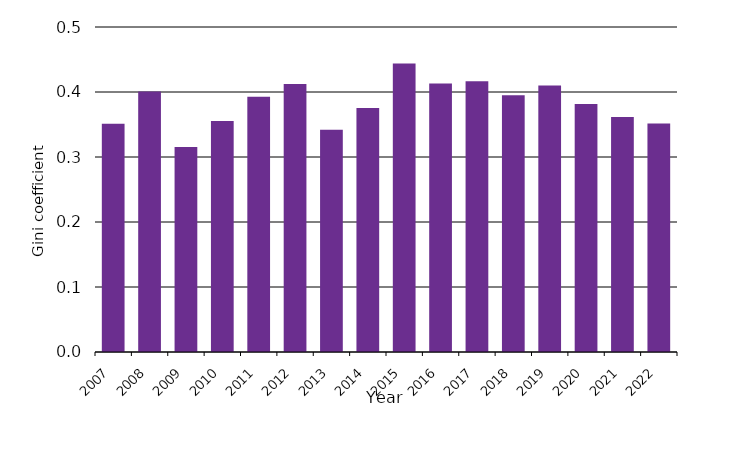
| Category | Gini coefficient |
|---|---|
| 2007.0 | 0.351 |
| 2008.0 | 0.401 |
| 2009.0 | 0.315 |
| 2010.0 | 0.355 |
| 2011.0 | 0.393 |
| 2012.0 | 0.412 |
| 2013.0 | 0.342 |
| 2014.0 | 0.375 |
| 2015.0 | 0.444 |
| 2016.0 | 0.413 |
| 2017.0 | 0.417 |
| 2018.0 | 0.395 |
| 2019.0 | 0.41 |
| 2020.0 | 0.382 |
| 2021.0 | 0.362 |
| 2022.0 | 0.352 |